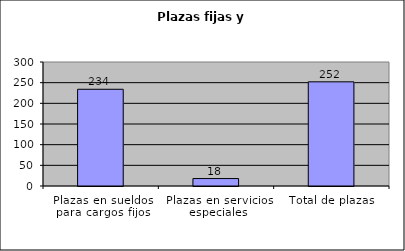
| Category | Series 0 |
|---|---|
| Plazas en sueldos para cargos fijos | 234 |
| Plazas en servicios especiales | 18 |
| Total de plazas | 252 |